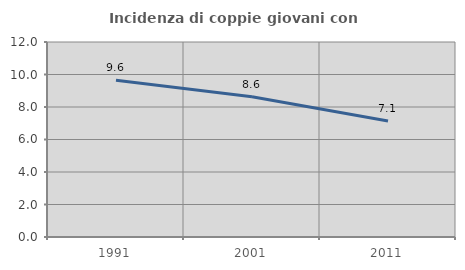
| Category | Incidenza di coppie giovani con figli |
|---|---|
| 1991.0 | 9.643 |
| 2001.0 | 8.633 |
| 2011.0 | 7.143 |